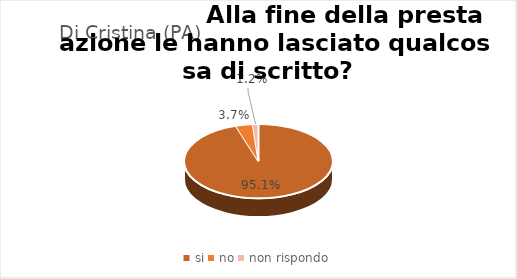
| Category | Amb Osp Dei Bambini G. Di Cristina (PA) |
|---|---|
| si | 0.951 |
| no | 0.037 |
| non rispondo | 0.012 |